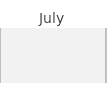
| Category | 1 | Fill 1 | 2 | Fill 2 | 3 | Fill 3 | 4 | Fill 4 | 5 | Fill 5 | 6 | Fill 6 | 7 | Fill 7 | 8 | Fill 8 | 9 | Fill 9 | 10 | Fill 10 | 11 | Fill 11 | 12 | Fill 12 | 13 | Fill 13 | 14 | Fill 14 | 15 | Fill 15 | 16 | Fill 16 | 17 | Fill 17 | 18 | Fill 18 | 19 | Fill 19 | 20 | Fill 20 | 21 | Fill 21 | 22 | Fill 22 | 23 | Fill 23 | 24 | Fill 24 | 25 | Fill 25 | 26 | Fill 26 | 27 | Fill 27 | 28 | Fill 28 | 29 | Fill 29 | 30 | Fill 30 | 31 | Fill 31 |
|---|---|---|---|---|---|---|---|---|---|---|---|---|---|---|---|---|---|---|---|---|---|---|---|---|---|---|---|---|---|---|---|---|---|---|---|---|---|---|---|---|---|---|---|---|---|---|---|---|---|---|---|---|---|---|---|---|---|---|---|---|---|---|
| STSH | 0 | 1 | 0 | 1 | 0 | 1 | 0 | 1 | 0 | 1 | 0 | 1 | 0 | 1 | 0 | 1 | 0 | 1 | 0 | 1 | 0 | 1 | 0 | 1 | 0 | 1 | 0 | 1 | 0 | 1 | 0 | 1 | 0 | 1 | 0 | 1 | 0 | 1 | 0 | 1 | 0 | 1 | 0 | 1 | 0 | 1 | 0 | 1 | 0 | 1 | 0 | 1 | 0 | 1 | 0 | 1 | 0 | 1 | 0 | 1 | 0 | 1 |